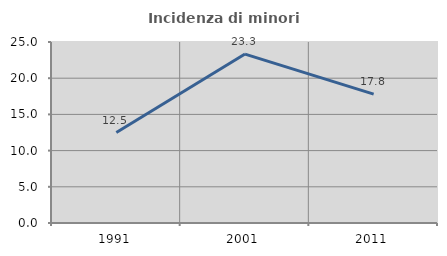
| Category | Incidenza di minori stranieri |
|---|---|
| 1991.0 | 12.5 |
| 2001.0 | 23.333 |
| 2011.0 | 17.808 |